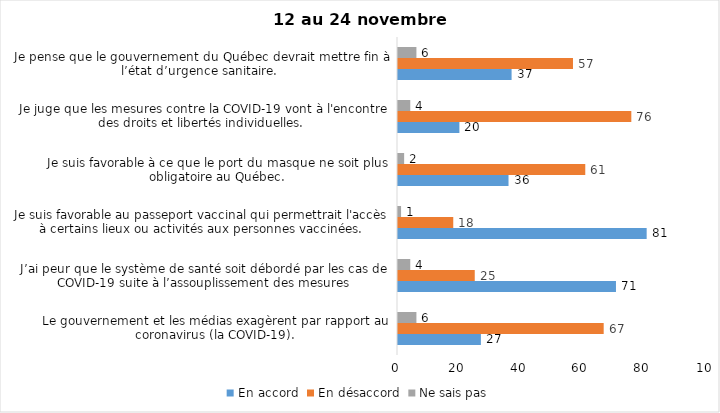
| Category | En accord | En désaccord | Ne sais pas |
|---|---|---|---|
| Le gouvernement et les médias exagèrent par rapport au coronavirus (la COVID-19). | 27 | 67 | 6 |
| J’ai peur que le système de santé soit débordé par les cas de COVID-19 suite à l’assouplissement des mesures | 71 | 25 | 4 |
| Je suis favorable au passeport vaccinal qui permettrait l'accès à certains lieux ou activités aux personnes vaccinées. | 81 | 18 | 1 |
| Je suis favorable à ce que le port du masque ne soit plus obligatoire au Québec. | 36 | 61 | 2 |
| Je juge que les mesures contre la COVID-19 vont à l'encontre des droits et libertés individuelles.  | 20 | 76 | 4 |
| Je pense que le gouvernement du Québec devrait mettre fin à l’état d’urgence sanitaire.  | 37 | 57 | 6 |